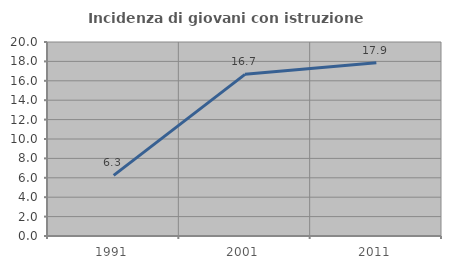
| Category | Incidenza di giovani con istruzione universitaria |
|---|---|
| 1991.0 | 6.25 |
| 2001.0 | 16.667 |
| 2011.0 | 17.857 |